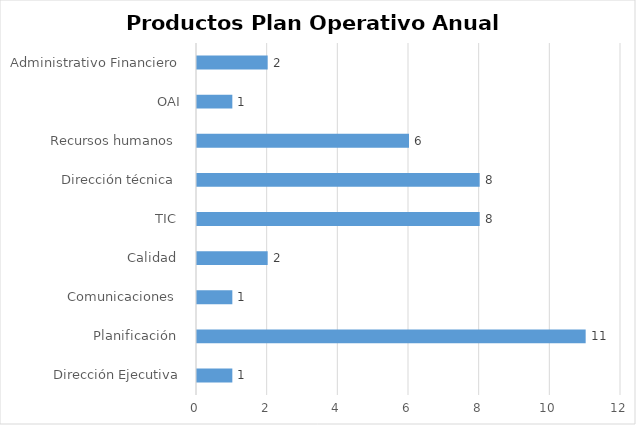
| Category | Series 0 |
|---|---|
| Dirección Ejecutiva | 1 |
| Planificación  | 11 |
| Comunicaciones  | 1 |
| Calidad  | 2 |
| TIC  | 8 |
| Dirección técnica  | 8 |
| Recursos humanos  | 6 |
| OAI | 1 |
| Administrativo Financiero | 2 |